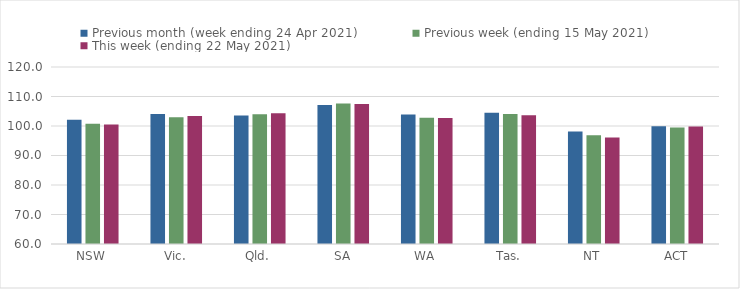
| Category | Previous month (week ending 24 Apr 2021) | Previous week (ending 15 May 2021) | This week (ending 22 May 2021) |
|---|---|---|---|
| NSW | 102.12 | 100.78 | 100.54 |
| Vic. | 104.1 | 102.98 | 103.37 |
| Qld. | 103.6 | 103.97 | 104.29 |
| SA | 107.11 | 107.64 | 107.44 |
| WA | 103.87 | 102.81 | 102.72 |
| Tas. | 104.49 | 104.04 | 103.68 |
| NT | 98.16 | 96.83 | 96.12 |
| ACT | 99.93 | 99.45 | 99.85 |